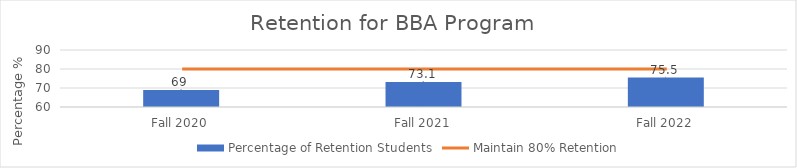
| Category | Percentage of Retention Students |
|---|---|
| Fall 2020 | 69 |
| Fall 2021 | 73.1 |
| Fall 2022 | 75.5 |